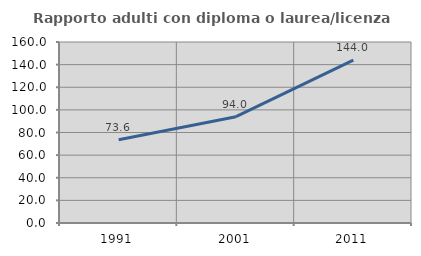
| Category | Rapporto adulti con diploma o laurea/licenza media  |
|---|---|
| 1991.0 | 73.611 |
| 2001.0 | 93.966 |
| 2011.0 | 144 |